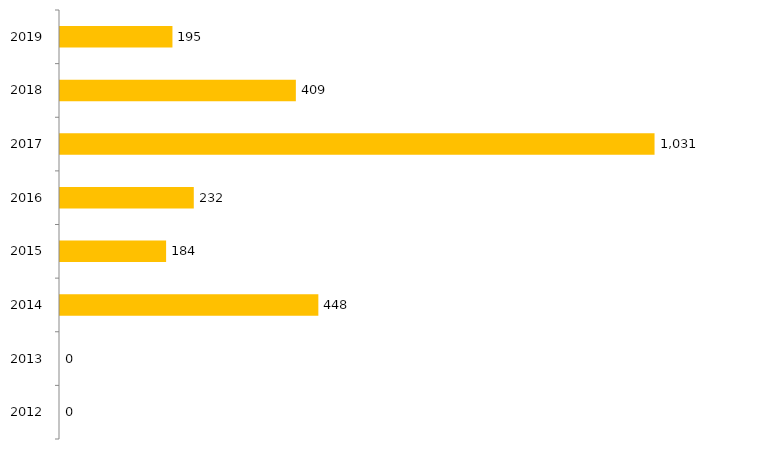
| Category | Inscritos |
|---|---|
| 2012.0 | 0 |
| 2013.0 | 0 |
| 2014.0 | 448 |
| 2015.0 | 184 |
| 2016.0 | 232 |
| 2017.0 | 1031 |
| 2018.0 | 409 |
| 2019.0 | 195 |